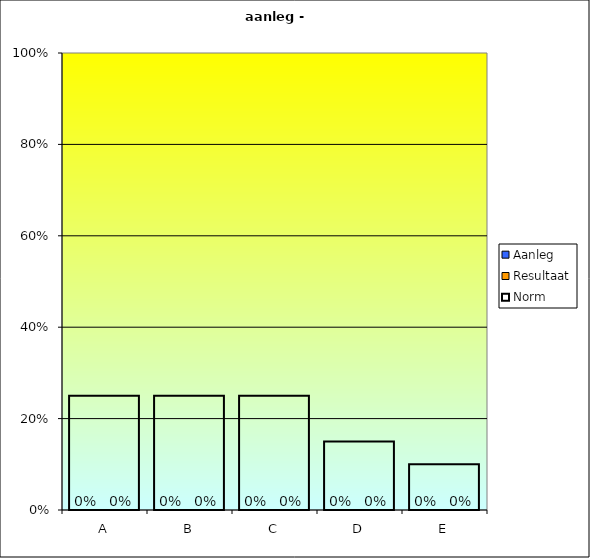
| Category | Aanleg | Resultaat |
|---|---|---|
| A | 0 | 0 |
| B | 0 | 0 |
| C | 0 | 0 |
| D | 0 | 0 |
| E | 0 | 0 |